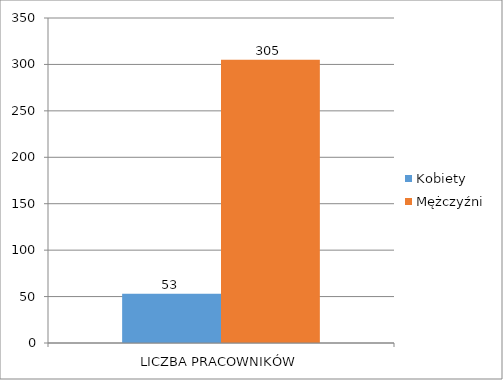
| Category | Kobiety | Mężczyźni |
|---|---|---|
| LICZBA PRACOWNIKÓW | 53 | 305 |